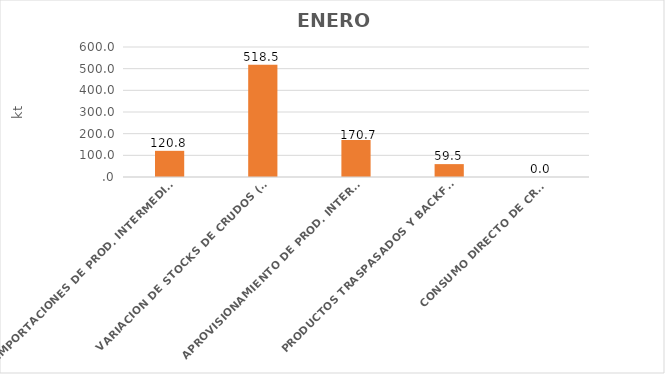
| Category | Series 0 |
|---|---|
| IMPORTACIONES DE PROD. INTERMEDIOS Y MAT. AUXILIARES | 120.794 |
| VARIACION DE STOCKS DE CRUDOS (Ef-Ei) | 518.528 |
| APROVISIONAMIENTO DE PROD. INTERMEDIOS Y MAT. AUXILIARES | 170.742 |
| PRODUCTOS TRASPASADOS Y BACKFLOWS | 59.488 |
| CONSUMO DIRECTO DE CRUDO | 0 |